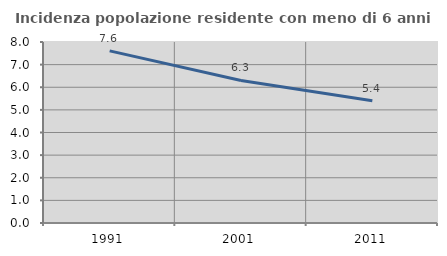
| Category | Incidenza popolazione residente con meno di 6 anni |
|---|---|
| 1991.0 | 7.608 |
| 2001.0 | 6.301 |
| 2011.0 | 5.403 |